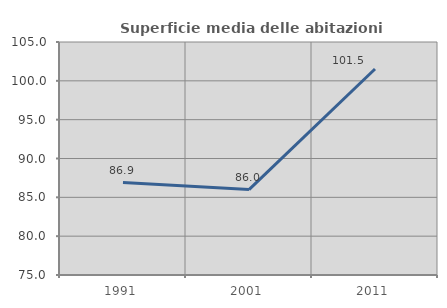
| Category | Superficie media delle abitazioni occupate |
|---|---|
| 1991.0 | 86.897 |
| 2001.0 | 86.003 |
| 2011.0 | 101.524 |